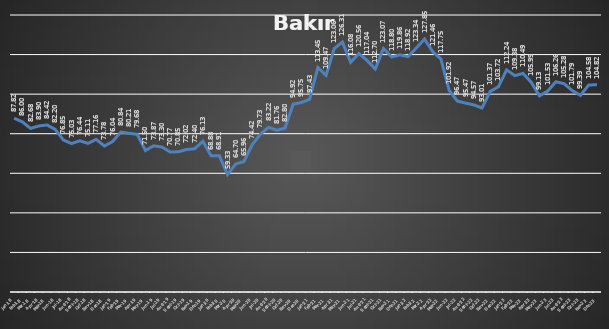
| Category | Series 0 |
|---|---|
| 2018-01-31 | 87.823 |
| 2018-02-28 | 85.999 |
| 2018-03-31 | 82.684 |
| 2018-04-30 | 83.896 |
| 2018-05-31 | 84.416 |
| 2018-06-30 | 82.202 |
| 2018-07-31 | 76.846 |
| 2018-08-31 | 75.034 |
| 2018-09-30 | 76.438 |
| 2018-10-31 | 75.114 |
| 2018-11-30 | 77.155 |
| 2018-12-31 | 73.779 |
| 2019-01-31 | 76.042 |
| 2019-02-28 | 80.841 |
| 2019-03-31 | 80.21 |
| 2019-04-30 | 79.678 |
| 2019-05-31 | 71.497 |
| 2019-06-30 | 73.865 |
| 2019-07-31 | 73.296 |
| 2019-08-31 | 70.773 |
| 2019-09-30 | 70.847 |
| 2019-10-31 | 72.022 |
| 2019-11-30 | 72.4 |
| 2019-12-31 | 76.135 |
| 2020-01-31 | 68.881 |
| 2020-02-29 | 68.905 |
| 2020-03-31 | 59.332 |
| 2020-04-30 | 64.7 |
| 2020-05-31 | 65.955 |
| 2020-06-30 | 74.416 |
| 2020-07-31 | 79.734 |
| 2020-08-31 | 83.216 |
| 2020-09-30 | 81.756 |
| 2020-10-31 | 82.801 |
| 2020-11-30 | 94.923 |
| 2020-12-31 | 95.751 |
| 2021-01-31 | 97.427 |
| 2021-02-28 | 113.451 |
| 2021-03-31 | 109.468 |
| 2021-04-30 | 123.055 |
| 2021-05-31 | 126.314 |
| 2021-06-30 | 116.079 |
| 2021-07-31 | 120.563 |
| 2021-08-31 | 117.038 |
| 2021-09-30 | 112.703 |
| 2021-10-31 | 123.067 |
| 2021-11-30 | 118.8 |
| 2021-12-31 | 119.864 |
| 2022-01-31 | 118.924 |
| 2022-02-28 | 123.34 |
| 2022-03-31 | 127.848 |
| 2022-04-30 | 121.459 |
| 2022-05-31 | 117.749 |
| 2022-06-30 | 101.917 |
| 2022-07-31 | 96.475 |
| 2022-08-31 | 95.473 |
| 2022-09-30 | 94.57 |
| 2022-10-31 | 93.012 |
| 2022-11-30 | 101.373 |
| 2022-12-31 | 103.723 |
| 2023-01-31 | 112.239 |
| 2023-02-28 | 109.375 |
| 2023-03-31 | 110.489 |
| 2023-04-30 | 105.986 |
| 2023-05-31 | 99.134 |
| 2023-06-30 | 101.534 |
| 2023-07-31 | 106.259 |
| 2023-08-31 | 105.281 |
| 2023-09-30 | 101.793 |
| 2023-10-31 | 99.394 |
| 2023-11-30 | 104.576 |
| 2023-12-31 | 104.824 |